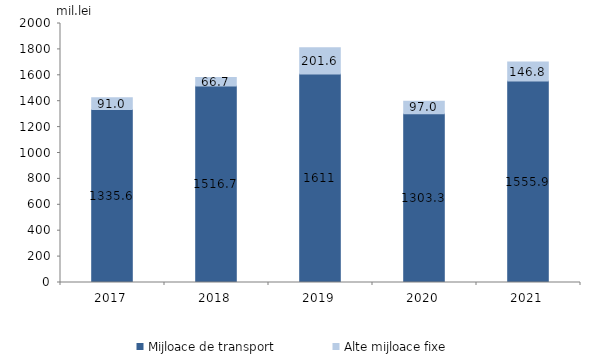
| Category | Mijloace de transport | Alte mijloace fixe |
|---|---|---|
| 2017.0 | 1335.6 | 91 |
| 2018.0 | 1516.7 | 66.7 |
| 2019.0 | 1611 | 201.6 |
| 2020.0 | 1303.3 | 97 |
| 2021.0 | 1555.9 | 146.8 |